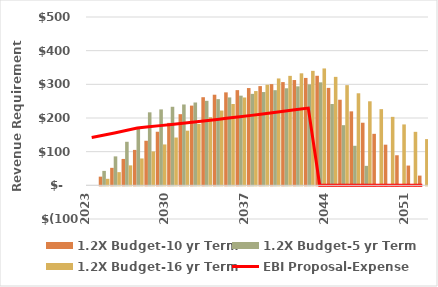
| Category | 1.2X Budget-10 yr Term | 1.2X Budget-5 yr Term | 1.2X Budget-16 yr Term |
|---|---|---|---|
| 2023.0 | 0 | 0 | 0 |
| 2024.0 | 25.814 | 42.886 | 19.413 |
| 2025.0 | 51.945 | 86.001 | 39.174 |
| 2026.0 | 78.41 | 129.36 | 59.303 |
| 2027.0 | 105.226 | 172.98 | 79.818 |
| 2028.0 | 132.413 | 216.877 | 100.739 |
| 2029.0 | 159.171 | 225.564 | 121.47 |
| 2030.0 | 185.491 | 233.336 | 142.008 |
| 2031.0 | 211.365 | 240.175 | 162.349 |
| 2032.0 | 236.784 | 246.064 | 182.488 |
| 2033.0 | 261.738 | 250.985 | 202.423 |
| 2034.0 | 269.148 | 256.005 | 222.148 |
| 2035.0 | 276.161 | 261.125 | 241.659 |
| 2036.0 | 282.77 | 266.347 | 260.953 |
| 2037.0 | 288.969 | 271.674 | 280.025 |
| 2038.0 | 294.748 | 277.108 | 298.87 |
| 2039.0 | 300.643 | 282.65 | 317.484 |
| 2040.0 | 306.656 | 288.303 | 325.193 |
| 2041.0 | 312.789 | 294.069 | 332.715 |
| 2042.0 | 319.045 | 299.951 | 340.049 |
| 2043.0 | 325.426 | 305.95 | 347.189 |
| 2044.0 | 289.468 | 241.519 | 322.198 |
| 2045.0 | 254.23 | 178.677 | 297.606 |
| 2046.0 | 219.725 | 117.455 | 273.421 |
| 2047.0 | 185.968 | 57.885 | 249.651 |
| 2048.0 | 152.975 | 0 | 226.305 |
| 2049.0 | 120.76 | 0 | 203.391 |
| 2050.0 | 89.339 | 0 | 180.918 |
| 2051.0 | 58.728 | 0 | 158.894 |
| 2052.0 | 28.942 | 0 | 137.328 |